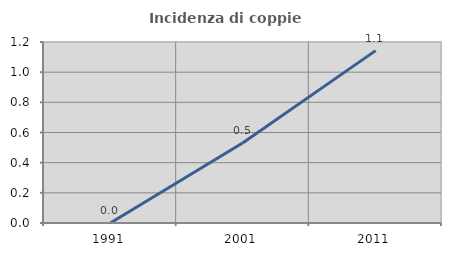
| Category | Incidenza di coppie miste |
|---|---|
| 1991.0 | 0 |
| 2001.0 | 0.532 |
| 2011.0 | 1.143 |